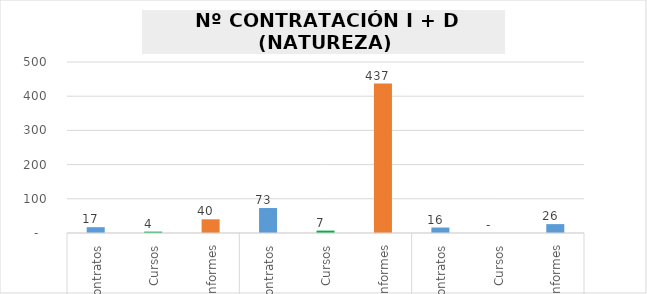
| Category | Series 0 |
|---|---|
| 0 | 17 |
| 1 | 4 |
| 2 | 40 |
| 3 | 73 |
| 4 | 7 |
| 5 | 437 |
| 6 | 16 |
| 7 | 0 |
| 8 | 26 |